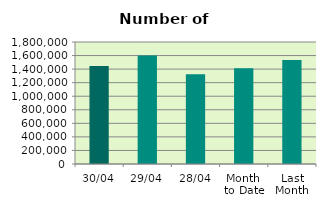
| Category | Series 0 |
|---|---|
| 30/04 | 1446056 |
| 29/04 | 1602200 |
| 28/04 | 1324810 |
| Month 
to Date | 1414476.2 |
| Last
Month | 1535393.739 |